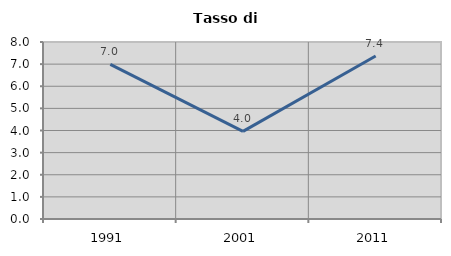
| Category | Tasso di disoccupazione   |
|---|---|
| 1991.0 | 6.988 |
| 2001.0 | 3.961 |
| 2011.0 | 7.368 |